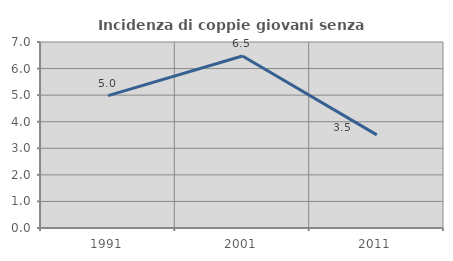
| Category | Incidenza di coppie giovani senza figli |
|---|---|
| 1991.0 | 4.984 |
| 2001.0 | 6.472 |
| 2011.0 | 3.506 |